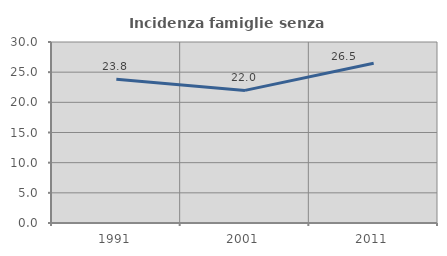
| Category | Incidenza famiglie senza nuclei |
|---|---|
| 1991.0 | 23.819 |
| 2001.0 | 21.981 |
| 2011.0 | 26.477 |